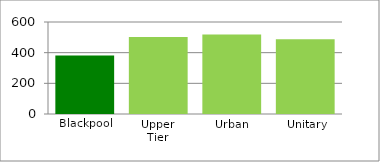
| Category | Series 1 |
|---|---|
| Blackpool | 381.3 |
| Upper Tier | 502.904 |
| Urban | 518.326 |
| Unitary | 487.524 |